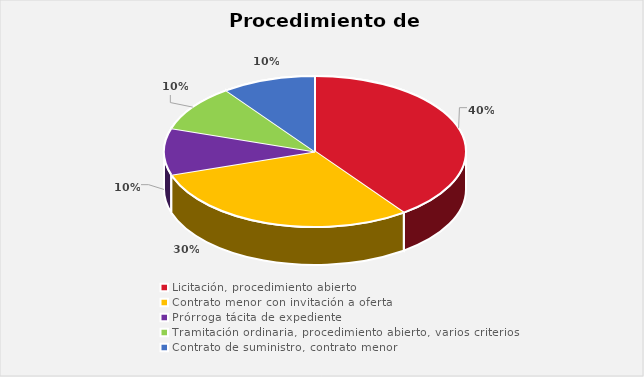
| Category | % sobre el total de contratos |
|---|---|
| Licitación, procedimiento abierto | 0.4 |
| Contrato menor con invitación a oferta | 0.3 |
| Prórroga tácita de expediente | 0.1 |
| Tramitación ordinaria, procedimiento abierto, varios criterios | 0.1 |
| Contrato de suministro, contrato menor | 0.1 |